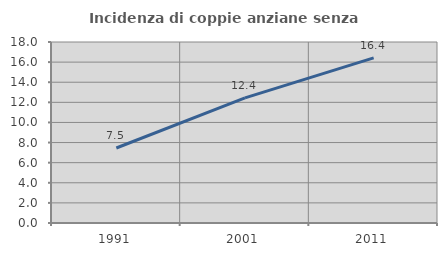
| Category | Incidenza di coppie anziane senza figli  |
|---|---|
| 1991.0 | 7.46 |
| 2001.0 | 12.445 |
| 2011.0 | 16.423 |